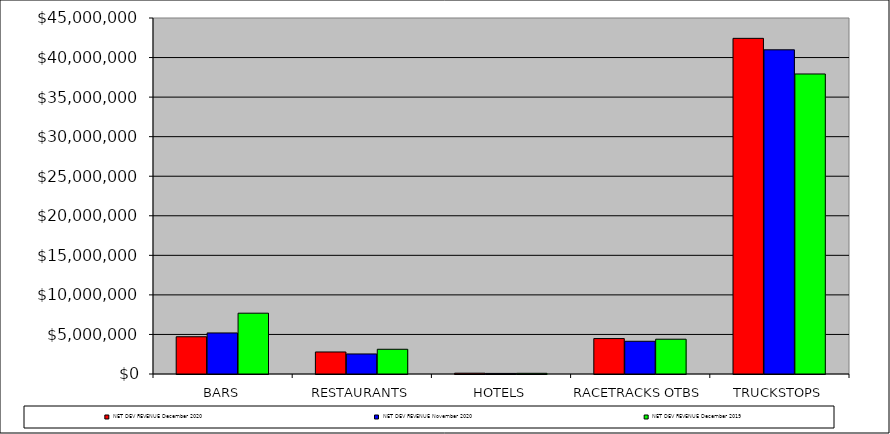
| Category | NET DEV REVENUE |
|---|---|
| BARS | 7686545 |
| RESTAURANTS | 3124625 |
| HOTELS | 87665 |
| RACETRACKS OTBS | 4397282 |
| TRUCKSTOPS | 37923655 |